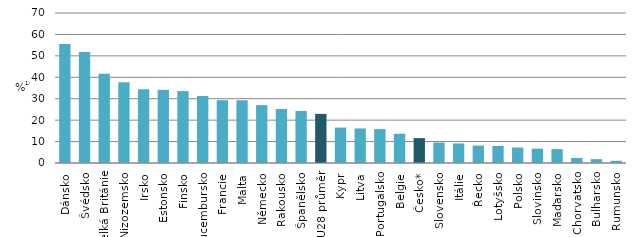
| Category | ubytování |
|---|---|
| Dánsko | 55.577 |
| Švédsko | 51.742 |
| Velká Británie | 41.7 |
| Nizozemsko | 37.667 |
| Irsko | 34.402 |
| Estonsko | 34.146 |
| Finsko | 33.553 |
| Lucembursko | 31.265 |
| Francie | 29.307 |
| Malta | 29.272 |
| Německo | 26.998 |
| Rakousko | 25.213 |
| Španělsko | 24.299 |
| EU28 průměr | 22.92 |
| Kypr | 16.543 |
| Litva | 16.125 |
| Portugalsko | 15.806 |
| Belgie | 13.669 |
| Česko* | 11.629 |
| Slovensko | 9.542 |
| Itálie | 9.112 |
| Řecko | 8.123 |
| Lotyšsko | 7.928 |
| Polsko | 7.245 |
| Slovinsko | 6.692 |
| Maďarsko | 6.486 |
| Chorvatsko | 2.372 |
| Bulharsko | 1.802 |
| Rumunsko | 1.04 |